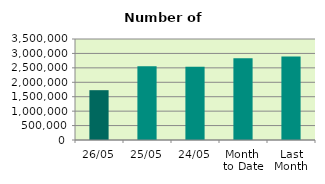
| Category | Series 0 |
|---|---|
| 26/05 | 1726626 |
| 25/05 | 2551900 |
| 24/05 | 2537730 |
| Month 
to Date | 2835499.789 |
| Last
Month | 2895009.158 |